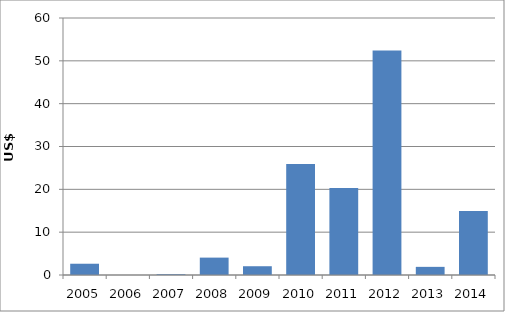
| Category | US$ millions |
|---|---|
| 2005.0 | 2.631 |
| 2006.0 | 0 |
| 2007.0 | 0.182 |
| 2008.0 | 4.059 |
| 2009.0 | 2.048 |
| 2010.0 | 25.936 |
| 2011.0 | 20.295 |
| 2012.0 | 52.386 |
| 2013.0 | 1.9 |
| 2014.0 | 14.926 |